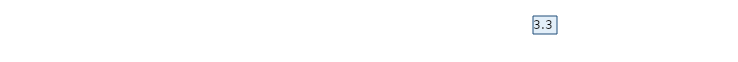
| Category | Итоговая оценка |
|---|---|
| Вопрос 4 | 3.3 |